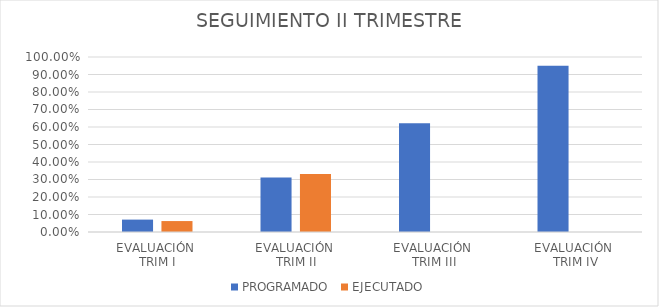
| Category | PROGRAMADO | EJECUTADO |
|---|---|---|
| EVALUACIÓN 
TRIM I | 0.071 | 0.062 |
| EVALUACIÓN 
TRIM II | 0.311 | 0.331 |
| EVALUACIÓN 
TRIM III | 0.622 | 0 |
| EVALUACIÓN
 TRIM IV | 0.95 | 0 |